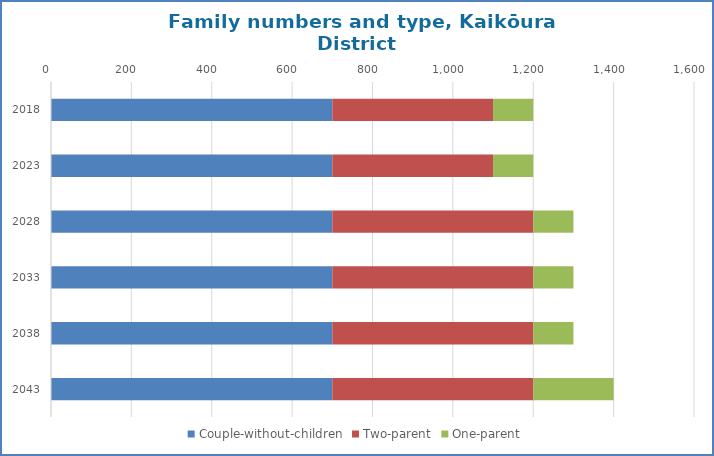
| Category | Couple-without-children | Two-parent | One-parent |
|---|---|---|---|
| 2018.0 | 700 | 400 | 100 |
| 2023.0 | 700 | 400 | 100 |
| 2028.0 | 700 | 500 | 100 |
| 2033.0 | 700 | 500 | 100 |
| 2038.0 | 700 | 500 | 100 |
| 2043.0 | 700 | 500 | 200 |